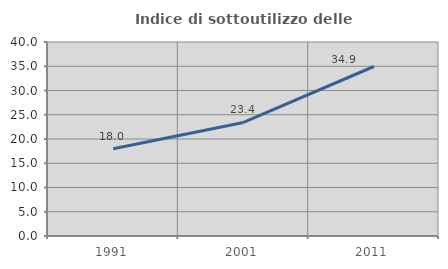
| Category | Indice di sottoutilizzo delle abitazioni  |
|---|---|
| 1991.0 | 17.981 |
| 2001.0 | 23.411 |
| 2011.0 | 34.948 |